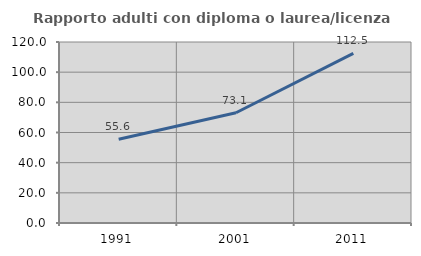
| Category | Rapporto adulti con diploma o laurea/licenza media  |
|---|---|
| 1991.0 | 55.556 |
| 2001.0 | 73.092 |
| 2011.0 | 112.513 |